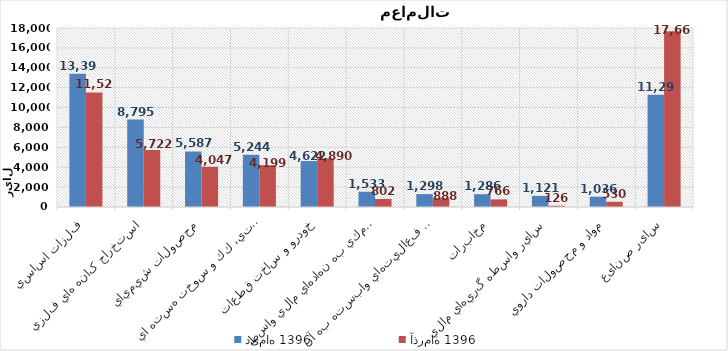
| Category | دی‌ماه 1396 | آذرماه 1396 |
|---|---|---|
| فلزات اساسي | 13396.637 | 11522.234 |
| استخراج کانه هاي فلزي | 8794.66 | 5722.241 |
| محصولات شيميايي | 5586.867 | 4047.029 |
| فراورده هاي نفتي، كك و سوخت هسته اي | 5243.905 | 4198.873 |
| خودرو و ساخت قطعات | 4622.441 | 4889.731 |
| فعاليتهاي كمكي به نهادهاي مالي واسط | 1532.634 | 802.398 |
| رايانه و فعاليت‌هاي وابسته به آن | 1298.359 | 888.342 |
| مخابرات | 1286.411 | 766.415 |
| ساير واسطه گريهاي مالي | 1121.428 | 125.693 |
| مواد و محصولات دارويي | 1035.883 | 529.602 |
| سایر صنایع | 11289.973 | 17668.309 |